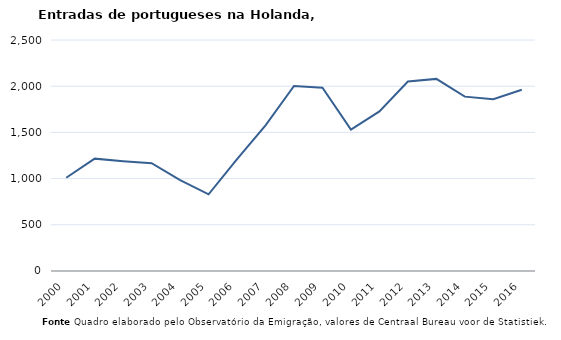
| Category | Entradas |
|---|---|
| 2000.0 | 1009 |
| 2001.0 | 1216 |
| 2002.0 | 1189 |
| 2003.0 | 1166 |
| 2004.0 | 984 |
| 2005.0 | 830 |
| 2006.0 | 1211 |
| 2007.0 | 1577 |
| 2008.0 | 2002 |
| 2009.0 | 1983 |
| 2010.0 | 1530 |
| 2011.0 | 1727 |
| 2012.0 | 2051 |
| 2013.0 | 2079 |
| 2014.0 | 1887 |
| 2015.0 | 1860 |
| 2016.0 | 1961 |